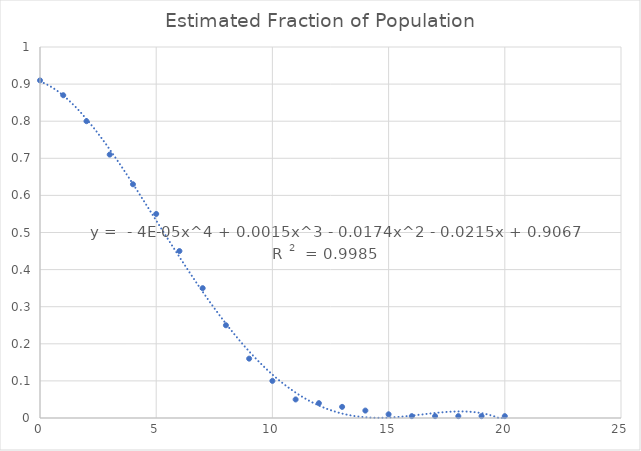
| Category | Estimated Fraction of Population |
|---|---|
| 0.0 | 0.91 |
| 1.0 | 0.87 |
| 2.0 | 0.8 |
| 3.0 | 0.71 |
| 4.0 | 0.63 |
| 5.0 | 0.55 |
| 6.0 | 0.45 |
| 7.0 | 0.35 |
| 8.0 | 0.25 |
| 9.0 | 0.16 |
| 10.0 | 0.1 |
| 11.0 | 0.05 |
| 12.0 | 0.04 |
| 13.0 | 0.03 |
| 14.0 | 0.02 |
| 15.0 | 0.01 |
| 16.0 | 0.005 |
| 17.0 | 0.005 |
| 18.0 | 0.005 |
| 19.0 | 0.005 |
| 20.0 | 0.005 |